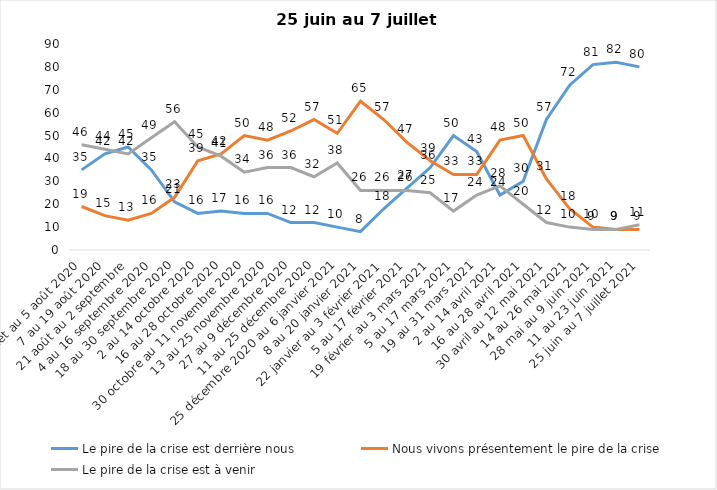
| Category | Le pire de la crise est derrière nous | Nous vivons présentement le pire de la crise | Le pire de la crise est à venir |
|---|---|---|---|
| 24 juillet au 5 août 2020 | 35 | 19 | 46 |
| 7 au 19 août 2020 | 42 | 15 | 44 |
| 21 août au 2 septembre | 45 | 13 | 42 |
| 4 au 16 septembre 2020 | 35 | 16 | 49 |
| 18 au 30 septembre 2020 | 21 | 23 | 56 |
| 2 au 14 octobre 2020 | 16 | 39 | 45 |
| 16 au 28 octobre 2020 | 17 | 42 | 41 |
| 30 octobre au 11 novembre 2020 | 16 | 50 | 34 |
| 13 au 25 novembre 2020 | 16 | 48 | 36 |
| 27 au 9 décembre 2020 | 12 | 52 | 36 |
| 11 au 25 décembre 2020 | 12 | 57 | 32 |
| 25 décembre 2020 au 6 janvier 2021 | 10 | 51 | 38 |
| 8 au 20 janvier 2021 | 8 | 65 | 26 |
| 22 janvier au 3 février 2021 | 18 | 57 | 26 |
| 5 au 17 février 2021 | 27 | 47 | 26 |
| 19 février au 3 mars 2021 | 36 | 39 | 25 |
| 5 au 17 mars 2021 | 50 | 33 | 17 |
| 19 au 31 mars 2021 | 43 | 33 | 24 |
| 2 au 14 avril 2021 | 24 | 48 | 28 |
| 16 au 28 avril 2021 | 30 | 50 | 20 |
| 30 avril au 12 mai 2021 | 57 | 31 | 12 |
| 14 au 26 mai 2021 | 72 | 18 | 10 |
| 28 mai au 9 juin 2021 | 81 | 10 | 9 |
| 11 au 23 juin 2021 | 82 | 9 | 9 |
| 25 juin au 7 juillet 2021 | 80 | 9 | 11 |